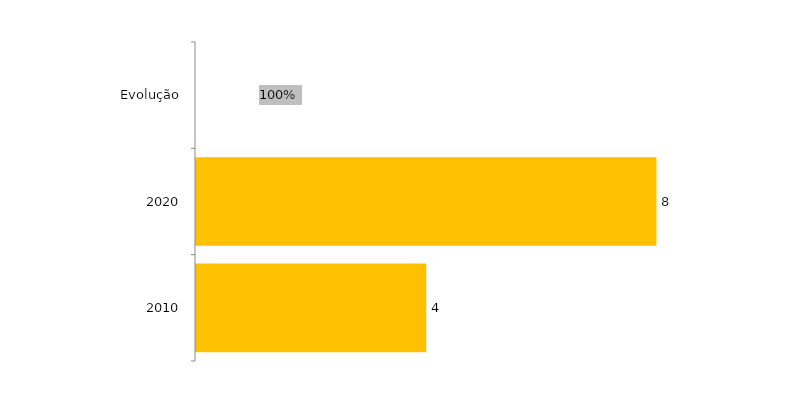
| Category | Evolução Residência |
|---|---|
| 2010 | 4 |
| 2020 | 8 |
| Evolução | 1 |